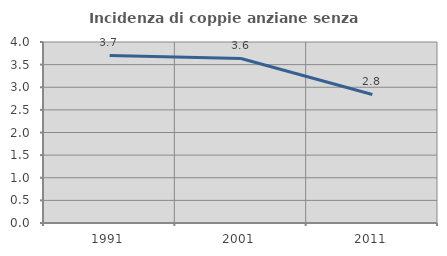
| Category | Incidenza di coppie anziane senza figli  |
|---|---|
| 1991.0 | 3.704 |
| 2001.0 | 3.636 |
| 2011.0 | 2.841 |